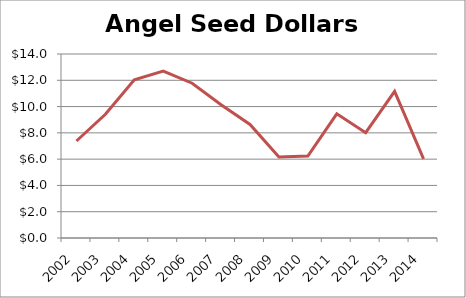
| Category | Angel Seed Dollars |
|---|---|
| 2002.0 | 7.379 |
| 2003.0 | 9.412 |
| 2004.0 | 12.038 |
| 2005.0 | 12.705 |
| 2006.0 | 11.776 |
| 2007.0 | 10.14 |
| 2008.0 | 8.64 |
| 2009.0 | 6.16 |
| 2010.0 | 6.231 |
| 2011.0 | 9.45 |
| 2012.0 | 8.015 |
| 2013.0 | 11.16 |
| 2014.0 | 6.025 |